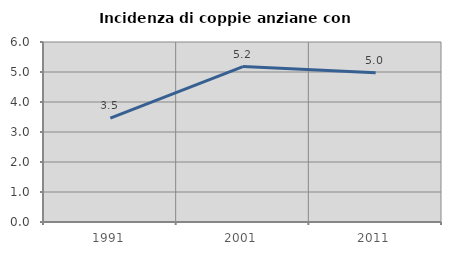
| Category | Incidenza di coppie anziane con figli |
|---|---|
| 1991.0 | 3.461 |
| 2001.0 | 5.182 |
| 2011.0 | 4.976 |